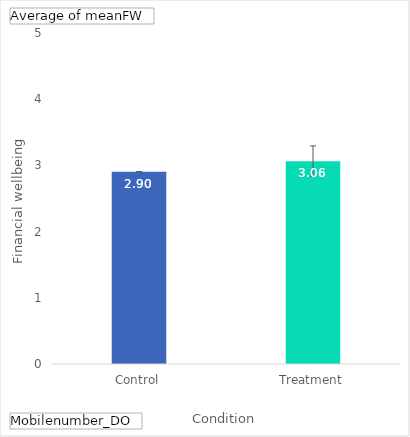
| Category | Total |
|---|---|
| Control | 2.904 |
| Treatment | 3.064 |